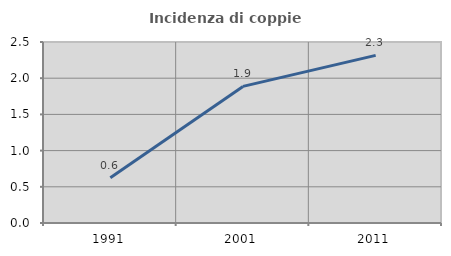
| Category | Incidenza di coppie miste |
|---|---|
| 1991.0 | 0.626 |
| 2001.0 | 1.887 |
| 2011.0 | 2.315 |